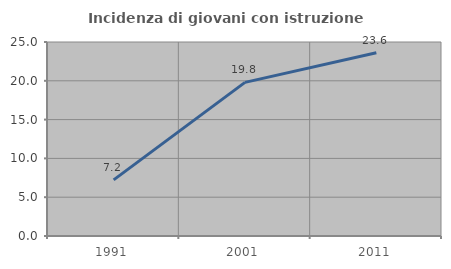
| Category | Incidenza di giovani con istruzione universitaria |
|---|---|
| 1991.0 | 7.237 |
| 2001.0 | 19.797 |
| 2011.0 | 23.611 |